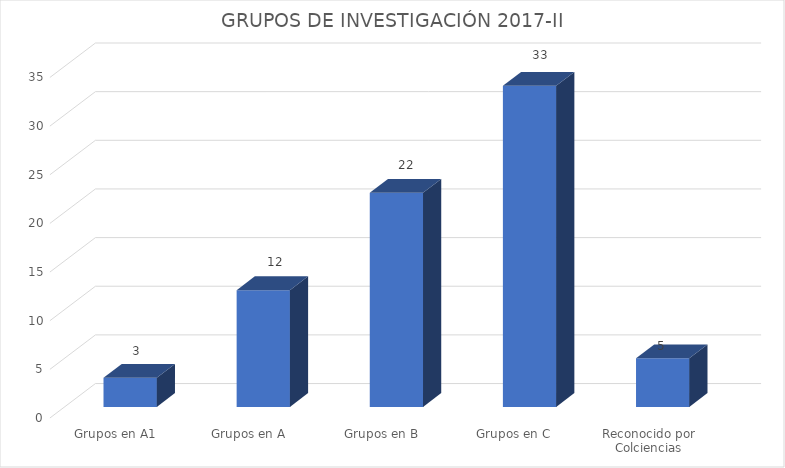
| Category | Grupos en A1 |
|---|---|
| Grupos en A1 | 3 |
| Grupos en A | 12 |
| Grupos en B | 22 |
| Grupos en C | 33 |
| Reconocido por Colciencias | 5 |